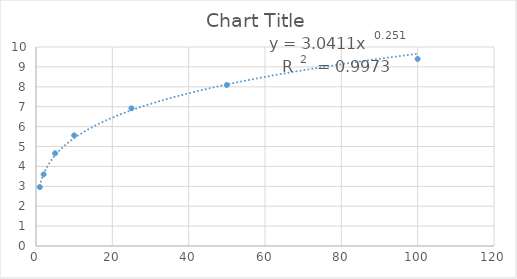
| Category | Series 0 |
|---|---|
| 1.0 | 2.96 |
| 2.0 | 3.6 |
| 5.0 | 4.66 |
| 10.0 | 5.56 |
| 25.0 | 6.92 |
| 50.0 | 8.09 |
| 100.0 | 9.4 |